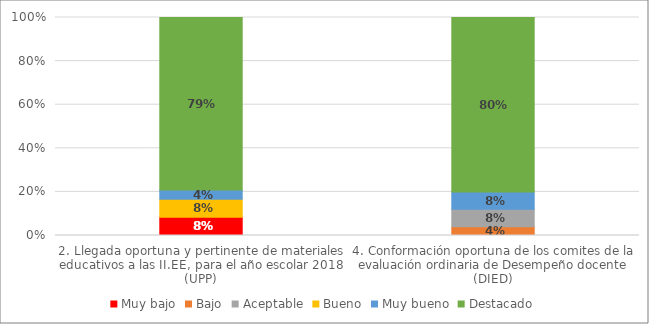
| Category | Muy bajo | Bajo | Aceptable | Bueno | Muy bueno | Destacado |
|---|---|---|---|---|---|---|
| 2. Llegada oportuna y pertinente de materiales educativos a las II.EE, para el año escolar 2018 (UPP) | 0.083 | 0 | 0 | 0.083 | 0.042 | 0.792 |
| 4. Conformación oportuna de los comites de la evaluación ordinaria de Desempeño docente (DIED) | 0 | 0.04 | 0.08 | 0 | 0.08 | 0.8 |